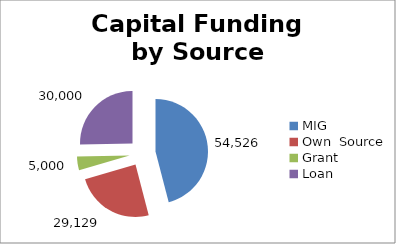
| Category | R '000 | % |
|---|---|---|
| MIG | 54526 | 0.46 |
| Own  Source | 29129 | 0.245 |
| Grant  | 5000 | 0.042 |
| Loan | 30000 | 0.253 |